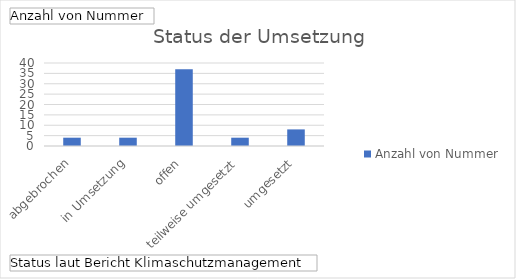
| Category | Ergebnis |
|---|---|
| abgebrochen | 4 |
| in Umsetzung | 4 |
| offen | 37 |
| teilweise umgesetzt | 4 |
| umgesetzt | 8 |